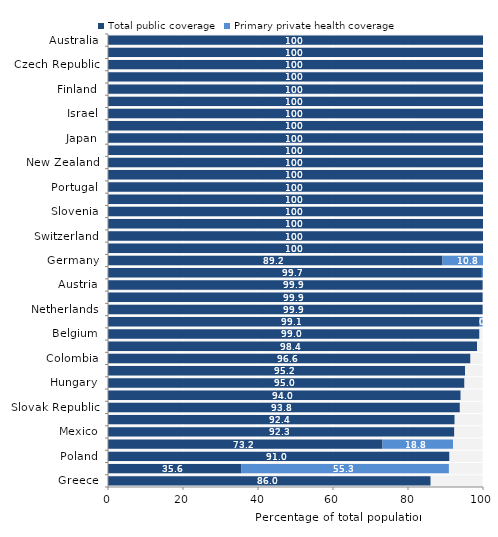
| Category | Total public coverage | Primary private health coverage |
|---|---|---|
| Greece | 86 | 0 |
| United States | 35.6 | 55.3 |
| Poland | 91 | 0 |
| Chile | 73.2 | 18.8 |
| Mexico | 92.3 | 0 |
| Lithuania | 92.4 | 0 |
| Slovak Republic | 93.8 | 0 |
| Estonia | 94 | 0 |
| Hungary | 95 | 0 |
| Luxembourg | 95.2 | 0 |
| Colombia | 96.6 | 0 |
| Turkey | 98.4 | 0 |
| Belgium | 99 | 0 |
| Spain | 99.1 | 0.8 |
| Netherlands | 99.9 | 0 |
| France | 99.9 | 0 |
| Austria | 99.9 | 0 |
| Iceland | 99.7 | 0.3 |
| Germany | 89.2 | 10.8 |
| United Kingdom | 100 | 0 |
| Switzerland | 100 | 0 |
| Sweden | 100 | 0 |
| Slovenia | 100 | 0 |
| Russian Fed. | 100 | 0 |
| Portugal | 100 | 0 |
| Norway | 100 | 0 |
| New Zealand | 100 | 0 |
| Korea | 100 | 0 |
| Japan | 100 | 0 |
| Italy | 100 | 0 |
| Israel | 100 | 0 |
| Ireland | 100 | 0 |
| Finland | 100 | 0 |
| Denmark | 100 | 0 |
| Czech Republic | 100 | 0 |
| Canada | 100 | 0 |
| Australia | 100 | 0 |